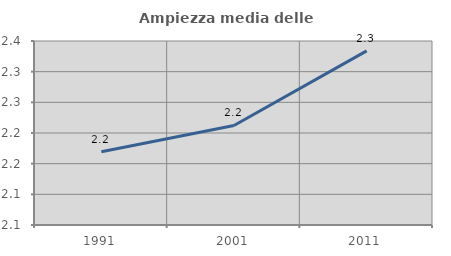
| Category | Ampiezza media delle famiglie |
|---|---|
| 1991.0 | 2.169 |
| 2001.0 | 2.212 |
| 2011.0 | 2.334 |